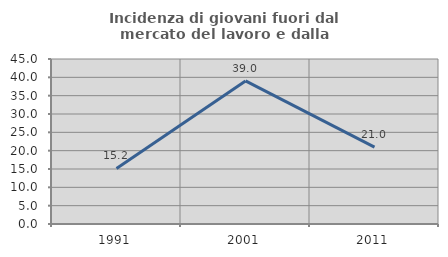
| Category | Incidenza di giovani fuori dal mercato del lavoro e dalla formazione  |
|---|---|
| 1991.0 | 15.163 |
| 2001.0 | 39.018 |
| 2011.0 | 20.984 |